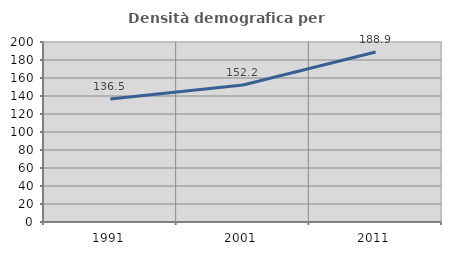
| Category | Densità demografica |
|---|---|
| 1991.0 | 136.548 |
| 2001.0 | 152.224 |
| 2011.0 | 188.948 |